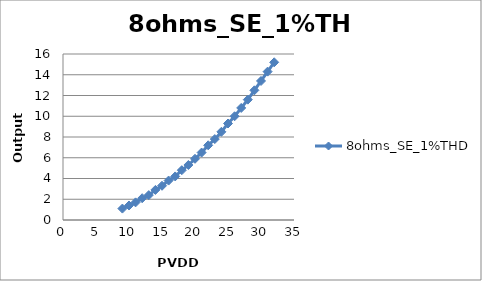
| Category | 8ohms_SE_1%THD |
|---|---|
| 9.0 | 1.1 |
| 10.0 | 1.4 |
| 11.0 | 1.7 |
| 12.0 | 2.1 |
| 13.0 | 2.4 |
| 14.0 | 2.9 |
| 15.0 | 3.3 |
| 16.0 | 3.8 |
| 17.0 | 4.2 |
| 18.0 | 4.8 |
| 19.0 | 5.3 |
| 20.0 | 5.9 |
| 21.0 | 6.5 |
| 22.0 | 7.2 |
| 23.0 | 7.8 |
| 24.0 | 8.5 |
| 25.0 | 9.3 |
| 26.0 | 10 |
| 27.0 | 10.8 |
| 28.0 | 11.6 |
| 29.0 | 12.5 |
| 30.0 | 13.4 |
| 31.0 | 14.3 |
| 32.0 | 15.2 |